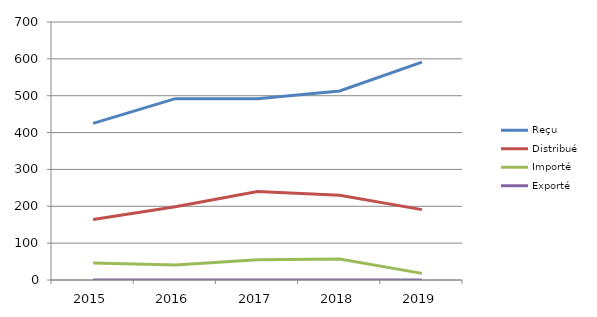
| Category | Reçu | Distribué | Importé | Exporté |
|---|---|---|---|---|
| 2015.0 | 425 | 164 | 46 | 0 |
| 2016.0 | 492 | 199 | 41 | 0 |
| 2017.0 | 492 | 240 | 55 | 0 |
| 2018.0 | 513 | 230 | 57 | 0 |
| 2019.0 | 591 | 191 | 18 | 0 |